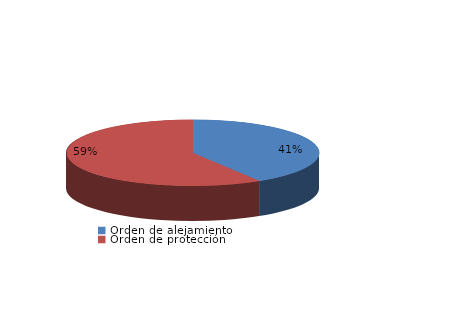
| Category | Series 0 |
|---|---|
| Orden de alejamiento | 7 |
| Orden de protección | 10 |